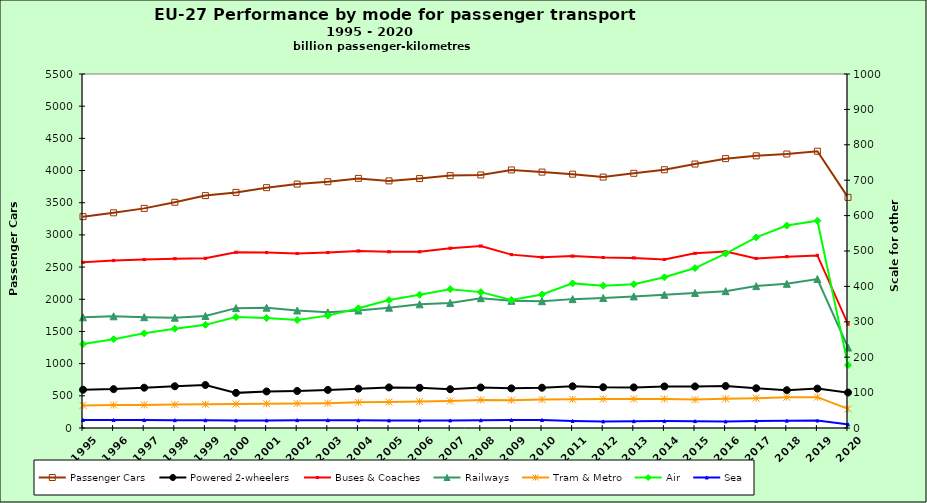
| Category | Passenger Cars |
|---|---|
| 1995.0 | 3283.764 |
| 1996.0 | 3343.401 |
| 1997.0 | 3412.199 |
| 1998.0 | 3507.134 |
| 1999.0 | 3610.558 |
| 2000.0 | 3660.355 |
| 2001.0 | 3734.216 |
| 2002.0 | 3789.305 |
| 2003.0 | 3826.196 |
| 2004.0 | 3878.163 |
| 2005.0 | 3839.179 |
| 2006.0 | 3875.261 |
| 2007.0 | 3921.256 |
| 2008.0 | 3931.624 |
| 2009.0 | 4009.212 |
| 2010.0 | 3975.851 |
| 2011.0 | 3943.643 |
| 2012.0 | 3898.452 |
| 2013.0 | 3957.205 |
| 2014.0 | 4012.517 |
| 2015.0 | 4101.014 |
| 2016.0 | 4184.965 |
| 2017.0 | 4228.53 |
| 2018.0 | 4256.985 |
| 2019.0 | 4299.862 |
| 2020.0 | 3582.954 |